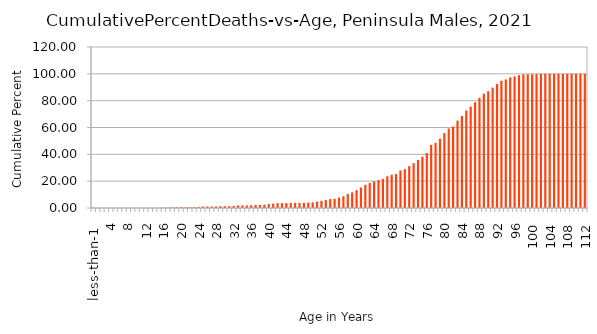
| Category | Series 0 |
|---|---|
| less-than-1  | 0 |
| 1 | 0 |
| 2 | 0 |
| 3 | 0 |
| 4 | 0 |
| 5 | 0 |
| 6 | 0 |
| 7 | 0 |
| 8 | 0 |
| 9 | 0 |
| 10 | 0 |
| 11 | 0 |
| 12 | 0 |
| 13 | 0 |
| 14 | 0 |
| 15 | 0 |
| 16 | 0.19 |
| 17 | 0.19 |
| 18 | 0.381 |
| 19 | 0.571 |
| 20 | 0.571 |
| 21 | 0.571 |
| 22 | 0.571 |
| 23 | 0.571 |
| 24 | 0.762 |
| 25 | 1.143 |
| 26 | 1.143 |
| 27 | 1.143 |
| 28 | 1.143 |
| 29 | 1.333 |
| 30 | 1.333 |
| 31 | 1.333 |
| 32 | 1.524 |
| 33 | 1.905 |
| 34 | 1.905 |
| 35 | 1.905 |
| 36 | 2.095 |
| 37 | 2.286 |
| 38 | 2.286 |
| 39 | 2.476 |
| 40 | 3.048 |
| 41 | 3.238 |
| 42 | 3.619 |
| 43 | 3.619 |
| 44 | 3.619 |
| 45 | 3.81 |
| 46 | 3.81 |
| 47 | 3.81 |
| 48 | 3.81 |
| 49 | 4 |
| 50 | 4.19 |
| 51 | 4.762 |
| 52 | 5.333 |
| 53 | 5.905 |
| 54 | 6.667 |
| 55 | 6.857 |
| 56 | 7.81 |
| 57 | 8.762 |
| 58 | 10.476 |
| 59 | 11.619 |
| 60 | 13.333 |
| 61 | 15.238 |
| 62 | 17.333 |
| 63 | 18.667 |
| 64 | 19.81 |
| 65 | 20.762 |
| 66 | 21.714 |
| 67 | 23.619 |
| 68 | 24.762 |
| 69 | 25.333 |
| 70 | 28 |
| 71 | 28.952 |
| 72 | 31.238 |
| 73 | 33.333 |
| 74 | 35.81 |
| 75 | 38.095 |
| 76 | 40.952 |
| 77 | 47.048 |
| 78 | 48.571 |
| 79 | 51.619 |
| 80 | 55.81 |
| 81 | 59.238 |
| 82 | 60.762 |
| 83 | 65.143 |
| 84 | 68.571 |
| 85 | 72.571 |
| 86 | 75.429 |
| 87 | 78.857 |
| 88 | 82.095 |
| 89 | 85.143 |
| 90 | 87.048 |
| 91 | 89.714 |
| 92 | 92.381 |
| 93 | 94.857 |
| 94 | 95.81 |
| 95 | 97.333 |
| 96 | 98.095 |
| 97 | 99.048 |
| 98 | 99.619 |
| 99 | 99.619 |
| 100 | 99.619 |
| 101 | 99.81 |
| 102 | 100 |
| 103 | 100 |
| 104 | 100 |
| 105 | 100 |
| 106 | 100 |
| 107 | 100 |
| 108 | 100 |
| 109 | 100 |
| 110 | 100 |
| 111 | 100 |
| 112 | 100 |